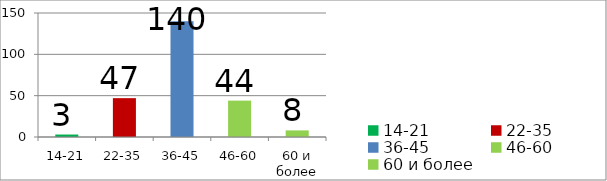
| Category | Series 0 |
|---|---|
| 14-21 | 3 |
| 22-35 | 47 |
| 36-45 | 140 |
| 46-60 | 44 |
| 60 и более | 8 |